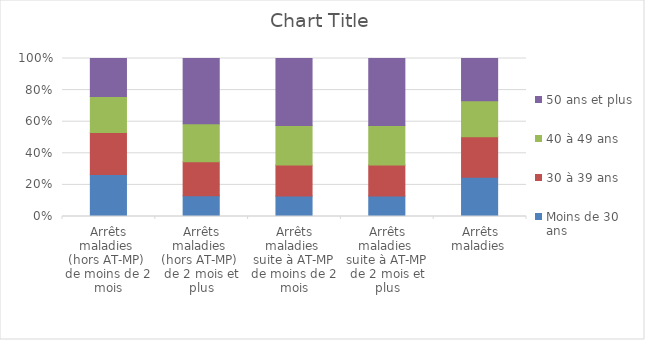
| Category | Moins de 30 ans | 30 à 39 ans | 40 à 49 ans | 50 ans et plus |
|---|---|---|---|---|
| Arrêts maladies 
(hors AT-MP) 
de moins de 2 mois | 0.265 | 0.266 | 0.228 | 0.241 |
| Arrêts maladies 
(hors AT-MP) 
de 2 mois et plus | 0.131 | 0.215 | 0.24 | 0.413 |
| Arrêts maladies 
suite à AT-MP
de moins de 2 mois | 0.13 | 0.196 | 0.25 | 0.424 |
| Arrêts maladies 
suite à AT-MP
de 2 mois et plus | 0.13 | 0.196 | 0.25 | 0.424 |
| Arrêts maladies 
 | 0.249 | 0.256 | 0.228 | 0.267 |